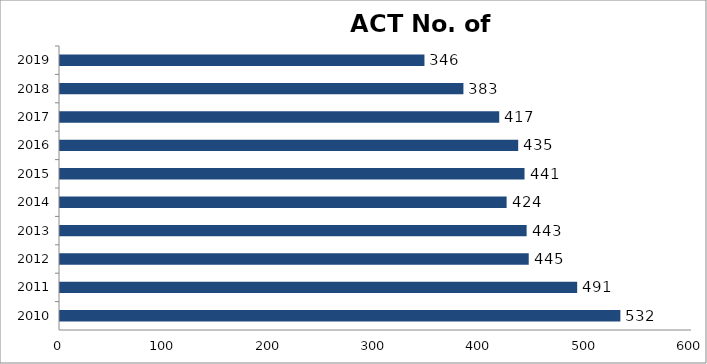
| Category | No. of vessels |
|---|---|
| 2010-01-01 | 532 |
| 2011-01-01 | 491 |
| 2012-01-01 | 445 |
| 2013-01-01 | 443 |
| 2014-01-01 | 424 |
| 2015-01-01 | 441 |
| 2016-01-01 | 435 |
| 2017-01-01 | 417 |
| 2018-01-01 | 383 |
| 2019-01-01 | 346 |